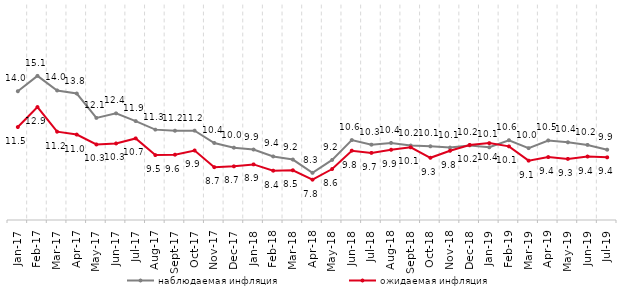
| Category | наблюдаемая инфляция | ожидаемая инфляция |
|---|---|---|
| 2017-01-01 | 13.983 | 11.486 |
| 2017-02-01 | 15.056 | 12.879 |
| 2017-03-01 | 14.037 | 11.162 |
| 2017-04-01 | 13.824 | 10.959 |
| 2017-05-01 | 12.123 | 10.27 |
| 2017-06-01 | 12.44 | 10.34 |
| 2017-07-01 | 11.9 | 10.692 |
| 2017-08-01 | 11.305 | 9.527 |
| 2017-09-01 | 11.229 | 9.556 |
| 2017-10-01 | 11.232 | 9.85 |
| 2017-11-01 | 10.372 | 8.687 |
| 2017-12-01 | 10.047 | 8.742 |
| 2018-01-01 | 9.916 | 8.879 |
| 2018-02-01 | 9.433 | 8.44 |
| 2018-03-01 | 9.218 | 8.469 |
| 2018-04-01 | 8.292 | 7.814 |
| 2018-05-01 | 9.192 | 8.556 |
| 2018-06-01 | 10.578 | 9.837 |
| 2018-07-01 | 10.255 | 9.682 |
| 2018-08-01 | 10.378 | 9.901 |
| 2018-09-01 | 10.196 | 10.07 |
| 2018-10-01 | 10.143 | 9.339 |
| 2018-11-01 | 10.053 | 9.831 |
| 2018-12-01 | 10.205 | 10.236 |
| 2019-01-01 | 10.071 | 10.363 |
| 2019-02-01 | 10.567 | 10.136 |
| 2019-03-01 | 10.013 | 9.141 |
| 2019-04-01 | 10.548 | 9.39 |
| 2019-05-01 | 10.421 | 9.264 |
| 2019-06-01 | 10.239 | 9.429 |
| 2019-07-01 | 9.904 | 9.371 |